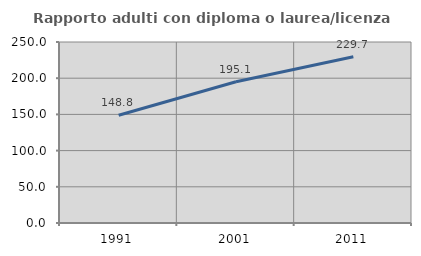
| Category | Rapporto adulti con diploma o laurea/licenza media  |
|---|---|
| 1991.0 | 148.78 |
| 2001.0 | 195.062 |
| 2011.0 | 229.712 |